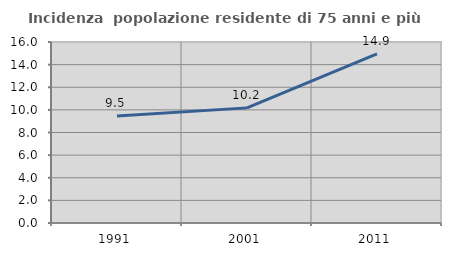
| Category | Incidenza  popolazione residente di 75 anni e più |
|---|---|
| 1991.0 | 9.464 |
| 2001.0 | 10.177 |
| 2011.0 | 14.944 |